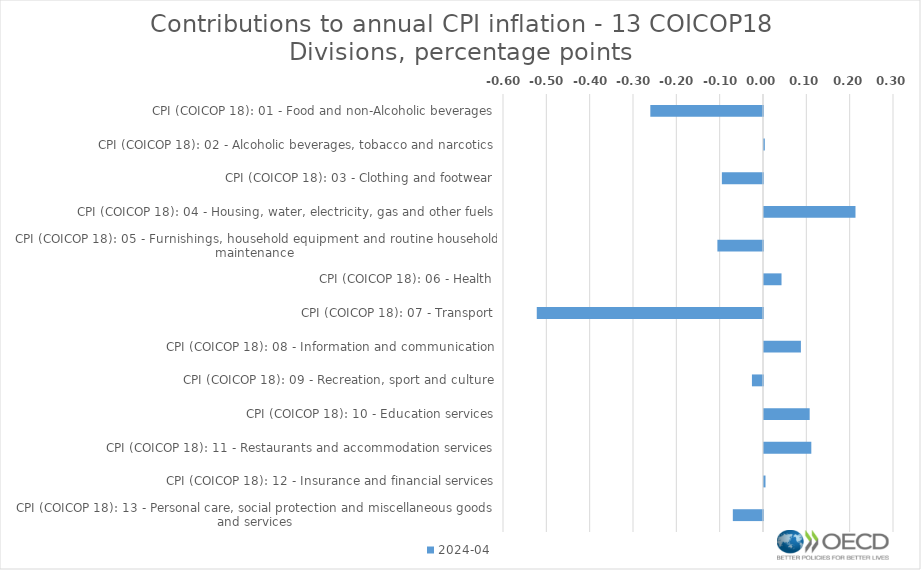
| Category | 2024-04 |
|---|---|
| CPI (COICOP 18): 01 - Food and non-Alcoholic beverages | -0.26 |
| CPI (COICOP 18): 02 - Alcoholic beverages, tobacco and narcotics | 0.002 |
| CPI (COICOP 18): 03 - Clothing and footwear | -0.095 |
| CPI (COICOP 18): 04 - Housing, water, electricity, gas and other fuels | 0.211 |
| CPI (COICOP 18): 05 - Furnishings, household equipment and routine household maintenance | -0.105 |
| CPI (COICOP 18): 06 - Health | 0.04 |
| CPI (COICOP 18): 07 - Transport | -0.522 |
| CPI (COICOP 18): 08 - Information and communication | 0.085 |
| CPI (COICOP 18): 09 - Recreation, sport and culture | -0.026 |
| CPI (COICOP 18): 10 - Education services | 0.105 |
| CPI (COICOP 18): 11 - Restaurants and accommodation services | 0.109 |
| CPI (COICOP 18): 12 - Insurance and financial services | 0.003 |
| CPI (COICOP 18): 13 - Personal care, social protection and miscellaneous goods and services | -0.07 |